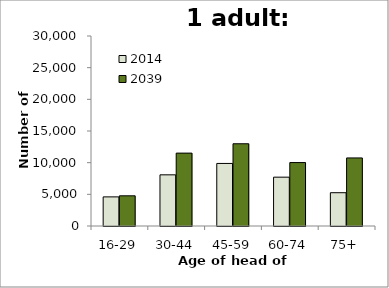
| Category | 2014 | 2039 |
|---|---|---|
| 16-29 | 4597 | 4767 |
| 30-44 | 8078 | 11508 |
| 45-59 | 9877 | 12985 |
| 60-74 | 7711 | 10014 |
| 75+ | 5257 | 10749 |